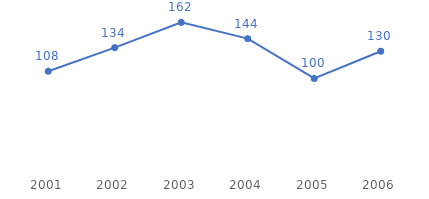
| Category | Series 0 |
|---|---|
| 2001.0 | 108 |
| 2002.0 | 134 |
| 2003.0 | 162 |
| 2004.0 | 144 |
| 2005.0 | 100 |
| 2006.0 | 130 |